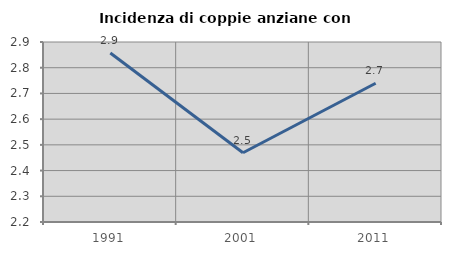
| Category | Incidenza di coppie anziane con figli |
|---|---|
| 1991.0 | 2.857 |
| 2001.0 | 2.469 |
| 2011.0 | 2.74 |